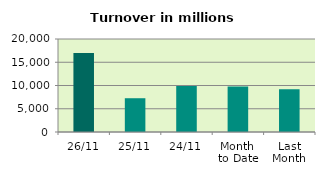
| Category | Series 0 |
|---|---|
| 26/11 | 17011.311 |
| 25/11 | 7262.248 |
| 24/11 | 9878.909 |
| Month 
to Date | 9780.651 |
| Last
Month | 9192.028 |